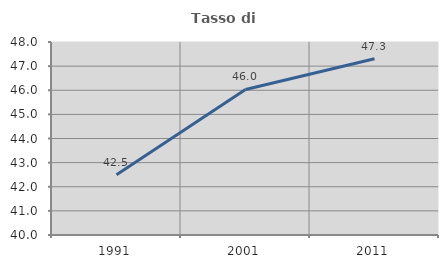
| Category | Tasso di occupazione   |
|---|---|
| 1991.0 | 42.497 |
| 2001.0 | 46.035 |
| 2011.0 | 47.308 |